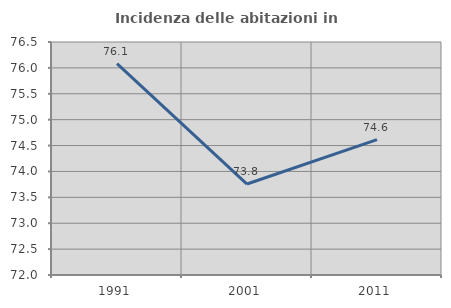
| Category | Incidenza delle abitazioni in proprietà  |
|---|---|
| 1991.0 | 76.083 |
| 2001.0 | 73.757 |
| 2011.0 | 74.615 |